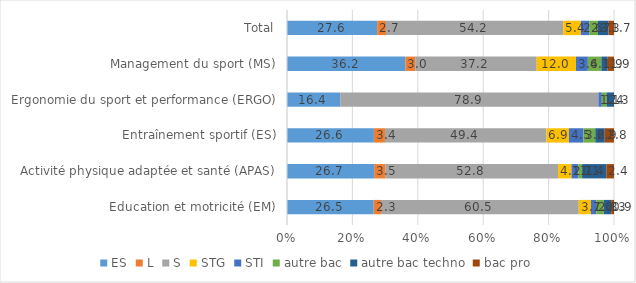
| Category | ES | L | S | STG | STI | autre bac | autre bac techno | bac pro |
|---|---|---|---|---|---|---|---|---|
| Education et motricité (EM) | 26.51 | 2.25 | 60.48 | 3.72 | 1.64 | 2.27 | 2.28 | 0.86 |
| Activité physique adaptée et santé (APAS) | 26.66 | 3.49 | 52.75 | 4.11 | 2.11 | 1.14 | 7.39 | 2.36 |
| Entraînement sportif (ES) | 26.58 | 3.38 | 49.38 | 6.87 | 4.46 | 3.6 | 2.91 | 2.82 |
| Ergonomie du sport et performance (ERGO) | 16.38 | 0 | 78.85 | 0 | 1.05 | 1.43 | 2.29 | 0 |
| Management du sport (MS) | 36.21 | 2.98 | 37.16 | 12.02 | 3.63 | 4.12 | 1.94 | 1.93 |
| Total | 27.58 | 2.68 | 54.22 | 5.36 | 2.57 | 2.66 | 3.27 | 1.66 |